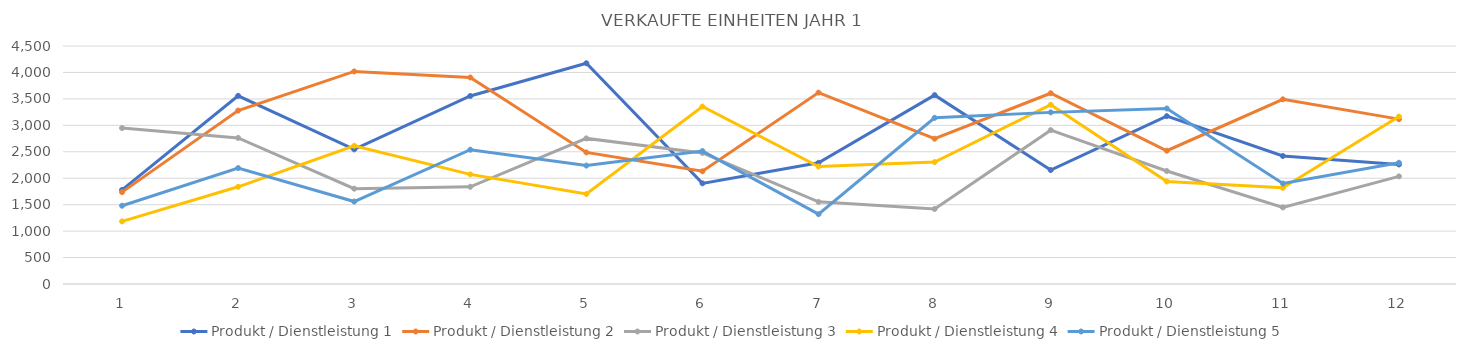
| Category | Produkt / Dienstleistung 1 | Produkt / Dienstleistung 2 | Produkt / Dienstleistung 3 | Produkt / Dienstleistung 4 | Produkt / Dienstleistung 5 |
|---|---|---|---|---|---|
| 0 | 1779 | 1737 | 2949 | 1184 | 1480 |
| 1 | 3557 | 3279 | 2762 | 1838 | 2192 |
| 2 | 2546 | 4019 | 1802 | 2613 | 1559 |
| 3 | 3555 | 3905 | 1838 | 2073 | 2539 |
| 4 | 4174 | 2488 | 2753 | 1702 | 2239 |
| 5 | 1903 | 2131 | 2478 | 3356 | 2513 |
| 6 | 2291 | 3619 | 1553 | 2222 | 1320 |
| 7 | 3571 | 2747 | 1419 | 2305 | 3142 |
| 8 | 2155 | 3607 | 2909 | 3390 | 3245 |
| 9 | 3174 | 2520 | 2137 | 1939 | 3318 |
| 10 | 2420 | 3492 | 1448 | 1819 | 1900 |
| 11 | 2260 | 3117 | 2035 | 3166 | 2292 |